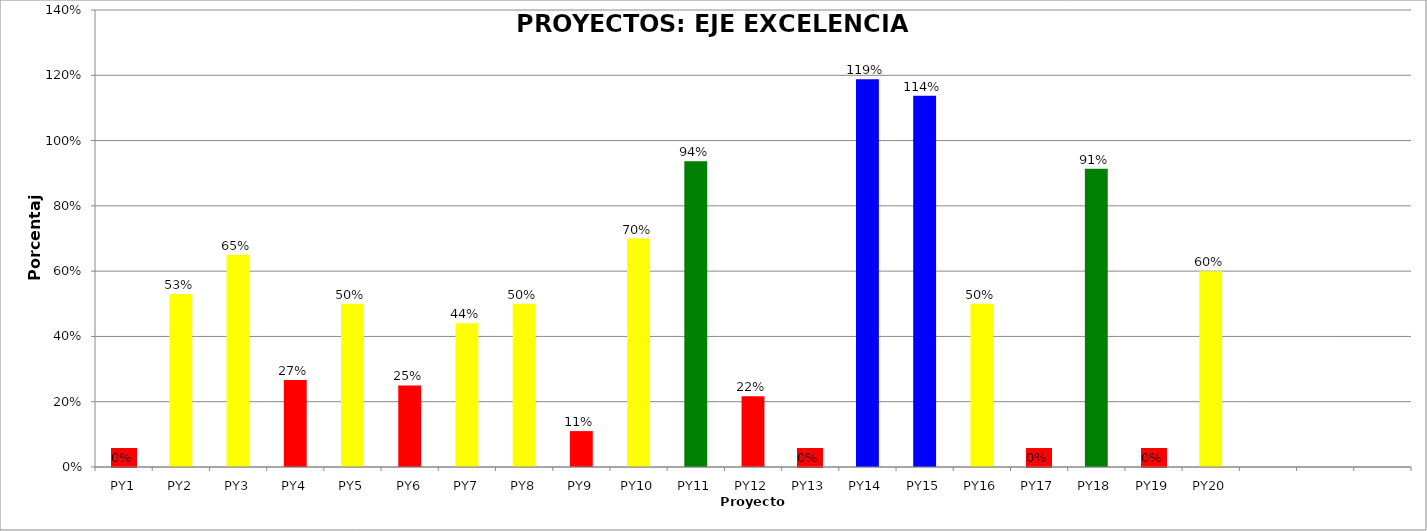
| Category | Series 0 |
|---|---|
| PY1 | 0 |
| PY2 | 0.53 |
| PY3 | 0.65 |
| PY4 | 0.267 |
| PY5 | 0.5 |
| PY6 | 0.25 |
| PY7 | 0.44 |
| PY8 | 0.5 |
| PY9 | 0.11 |
| PY10 | 0.7 |
| PY11 | 0.937 |
| PY12 | 0.216 |
| PY13 | 0 |
| PY14 | 1.188 |
| PY15 | 1.138 |
| PY16 | 0.5 |
| PY17 | 0 |
| PY18 | 0.913 |
| PY19 | 0 |
| PY20 | 0.6 |